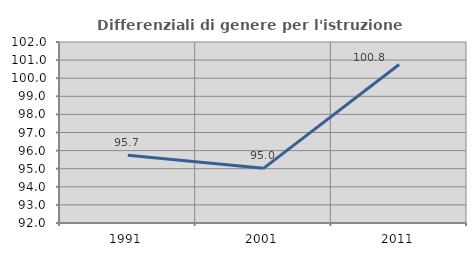
| Category | Differenziali di genere per l'istruzione superiore |
|---|---|
| 1991.0 | 95.748 |
| 2001.0 | 95.019 |
| 2011.0 | 100.755 |